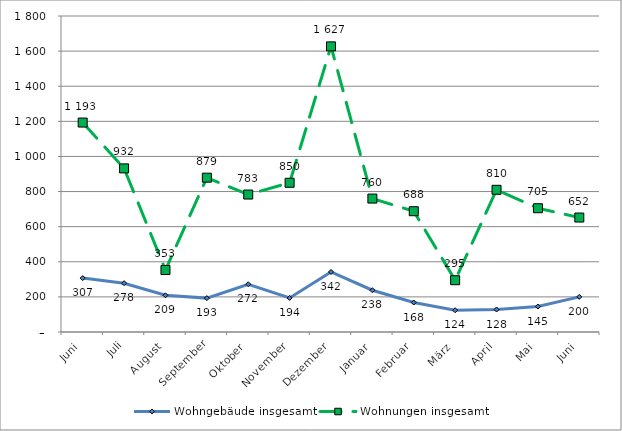
| Category | Wohngebäude insgesamt | Wohnungen insgesamt |
|---|---|---|
| Juni | 307 | 1193 |
| Juli | 278 | 932 |
| August | 209 | 353 |
| September | 193 | 879 |
| Oktober | 272 | 783 |
| November | 194 | 850 |
| Dezember | 342 | 1627 |
| Januar | 238 | 760 |
| Februar | 168 | 688 |
| März | 124 | 295 |
| April | 128 | 810 |
| Mai | 145 | 705 |
| Juni | 200 | 652 |